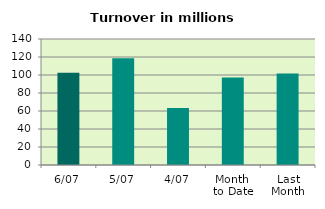
| Category | Series 0 |
|---|---|
| 6/07 | 102.502 |
| 5/07 | 118.733 |
| 4/07 | 63.205 |
| Month 
to Date | 97.263 |
| Last
Month | 101.544 |